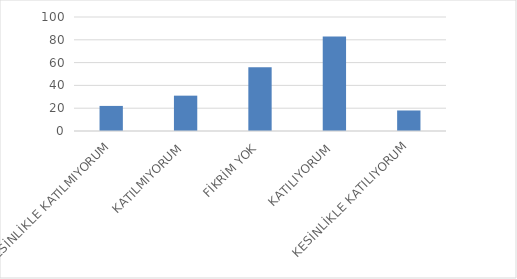
| Category | Series 0 |
|---|---|
| KESİNLİKLE KATILMIYORUM | 22 |
| KATILMIYORUM | 31 |
| FİKRİM YOK | 56 |
| KATILIYORUM | 83 |
| KESİNLİKLE KATILIYORUM | 18 |